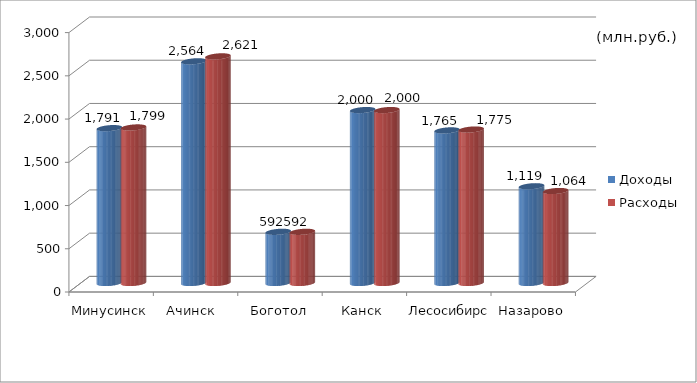
| Category | Доходы | Расходы |
|---|---|---|
| Минусинск | 1791 | 1799 |
| Ачинск  | 2564 | 2621 |
| Боготол | 592 | 592 |
| Канск | 2000 | 2000 |
| Лесосибирск | 1765 | 1775 |
| Назарово | 1119 | 1064 |